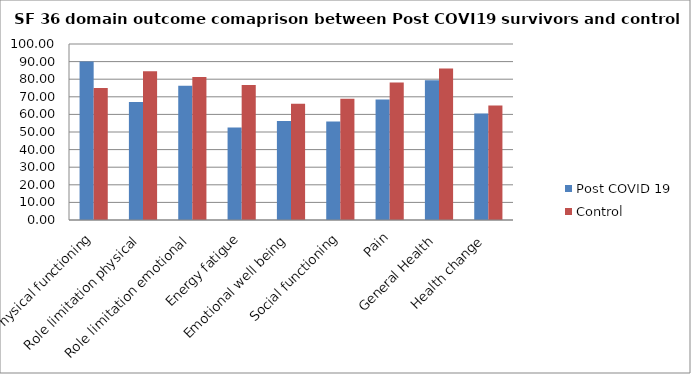
| Category | Post COVID 19 | Control |
|---|---|---|
| Physical functioning | 90 | 75 |
| Role limitation physical | 67.11 | 84.5 |
| Role limitation emotional | 76.32 | 81.25 |
| Energy fatigue | 52.62 | 76.67 |
| Emotional well being | 56.31 | 66 |
| Social functioning | 56 | 68.88 |
| Pain | 68.42 | 78.07 |
| General Health | 79.47 | 86.1 |
| Health change | 60.53 | 65 |